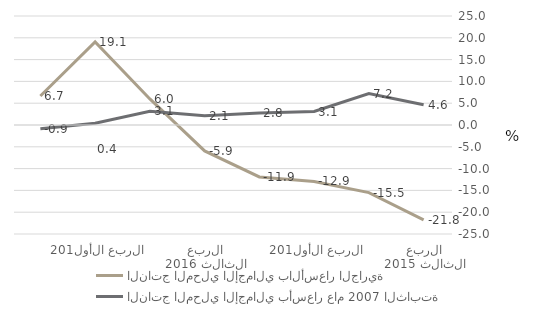
| Category | الناتج المحلي الإجمالي بالأسعار الجارية | الناتج المحلي الإجمالي بأسعار عام 2007 الثابتة  |
|---|---|---|
| الربع الثالث 2015 | -21.776 | 4.643 |
| الربع الرابع 2015 | -15.505 | 7.2 |
| الربع الأول 2016 | -12.938 | 3.095 |
| الربع الثاني 2016 | -11.906 | 2.753 |
| الربع الثالث 2016 | -5.947 | 2.135 |
| الربع الرابع 2016 | 5.981 | 3.132 |
| الربع الأول 2017 | 19.052 | 0.401 |
| الربع الثاني 2017 | 6.664 | -0.861 |